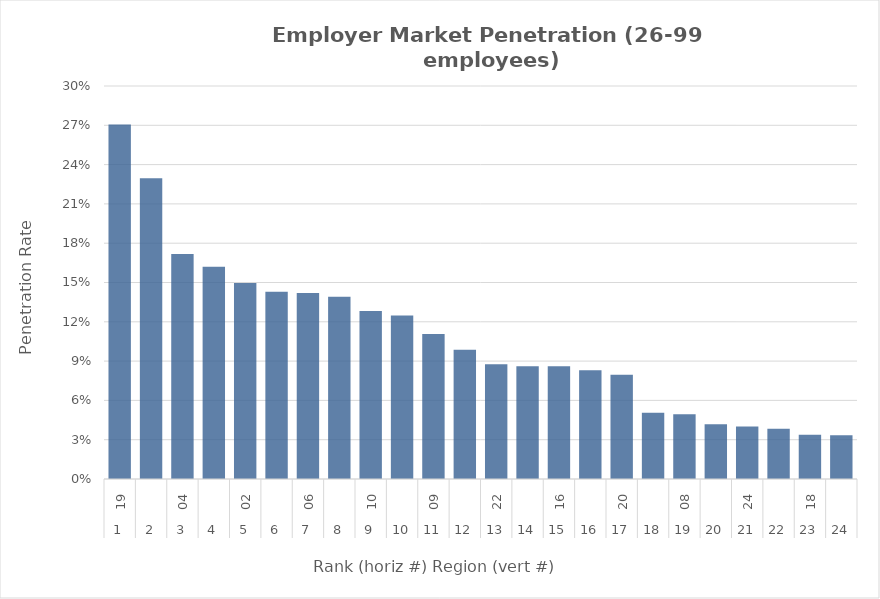
| Category | Rate |
|---|---|
| 0 | 0.271 |
| 1 | 0.23 |
| 2 | 0.172 |
| 3 | 0.162 |
| 4 | 0.15 |
| 5 | 0.143 |
| 6 | 0.142 |
| 7 | 0.139 |
| 8 | 0.128 |
| 9 | 0.125 |
| 10 | 0.111 |
| 11 | 0.099 |
| 12 | 0.088 |
| 13 | 0.086 |
| 14 | 0.086 |
| 15 | 0.083 |
| 16 | 0.08 |
| 17 | 0.051 |
| 18 | 0.049 |
| 19 | 0.042 |
| 20 | 0.04 |
| 21 | 0.038 |
| 22 | 0.034 |
| 23 | 0.033 |